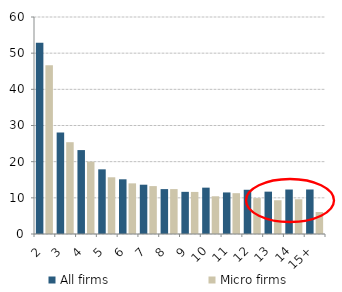
| Category | All firms | Micro firms |
|---|---|---|
| 2 | 52.9 | 46.655 |
| 3 | 28.083 | 25.383 |
| 4 | 23.203 | 20.019 |
| 5 | 17.878 | 15.682 |
| 6 | 15.126 | 14.003 |
| 7 | 13.629 | 13.246 |
| 8 | 12.415 | 12.416 |
| 9 | 11.659 | 11.632 |
| 10 | 12.815 | 10.435 |
| 11 | 11.492 | 11.286 |
| 12 | 12.231 | 9.925 |
| 13 | 11.71 | 9.334 |
| 14 | 12.299 | 9.605 |
| 15+ | 12.309 | 6.077 |